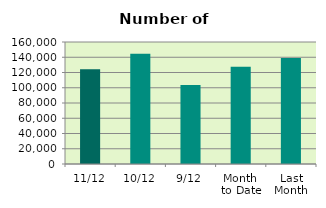
| Category | Series 0 |
|---|---|
| 11/12 | 124180 |
| 10/12 | 144514 |
| 9/12 | 103654 |
| Month 
to Date | 127435 |
| Last
Month | 138953.619 |